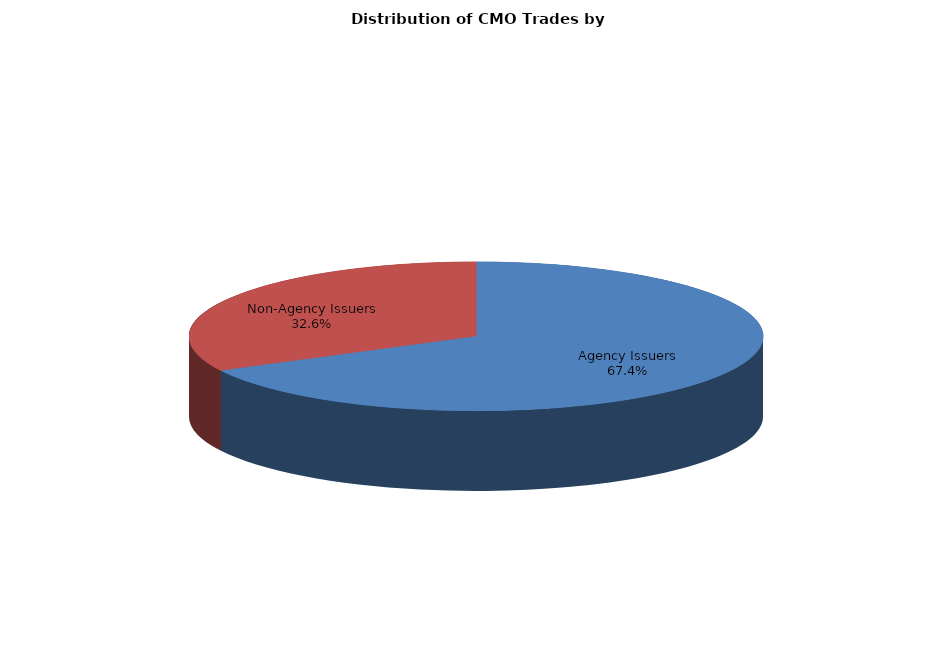
| Category | Series 0 |
|---|---|
| Agency Issuers | 1217.59 |
| Non-Agency Issuers | 588.629 |